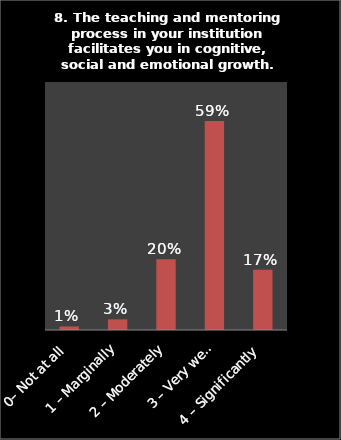
| Category | Series 0 |
|---|---|
| 0– Not at all | 0.01 |
| 1 – Marginally | 0.03 |
| 2 – Moderately | 0.2 |
| 3 – Very well | 0.59 |
| 4 – Significantly | 0.17 |